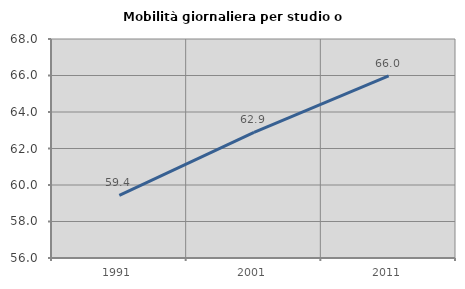
| Category | Mobilità giornaliera per studio o lavoro |
|---|---|
| 1991.0 | 59.431 |
| 2001.0 | 62.883 |
| 2011.0 | 65.983 |